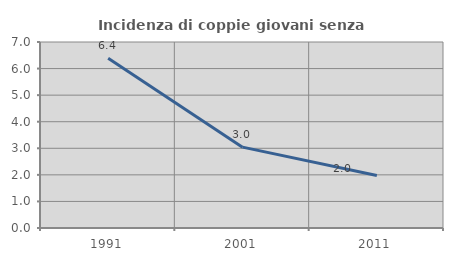
| Category | Incidenza di coppie giovani senza figli |
|---|---|
| 1991.0 | 6.388 |
| 2001.0 | 3.043 |
| 2011.0 | 1.976 |